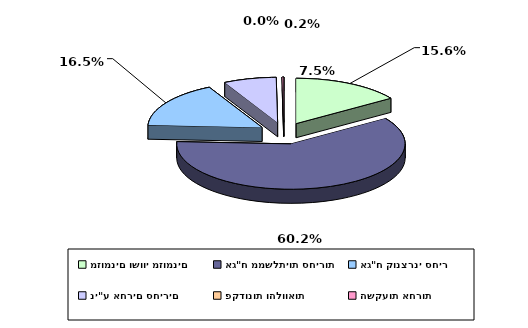
| Category | Series 0 |
|---|---|
| מזומנים ושווי מזומנים | 0.156 |
| אג"ח ממשלתיות סחירות | 0.602 |
| אג"ח קונצרני סחיר | 0.165 |
| ני"ע אחרים סחירים | 0.075 |
| פקדונות והלוואות | 0 |
| השקעות אחרות | 0.002 |